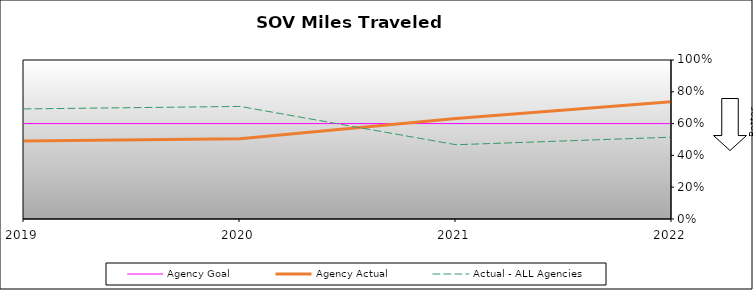
| Category | Agency Goal | Agency Actual | Actual - ALL Agencies |
|---|---|---|---|
| 2019.0 | 0.6 | 0.49 | 0.692 |
| 2020.0 | 0.6 | 0.505 | 0.708 |
| 2021.0 | 0.6 | 0.632 | 0.467 |
| 2022.0 | 0.6 | 0.738 | 0.515 |